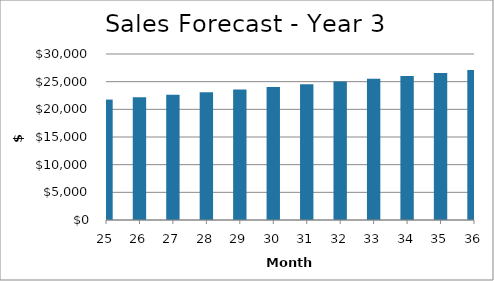
| Category | Year 3 |
|---|---|
| 25.0 | 21765.052 |
| 26.0 | 22202.53 |
| 27.0 | 22648.8 |
| 28.0 | 23104.041 |
| 29.0 | 23568.433 |
| 30.0 | 24042.158 |
| 31.0 | 24525.405 |
| 32.0 | 25018.366 |
| 33.0 | 25521.235 |
| 34.0 | 26034.212 |
| 35.0 | 26557.5 |
| 36.0 | 27091.305 |